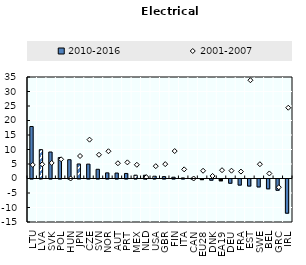
| Category | 2010-2016 |
|---|---|
| LTU | 17.933 |
| LVA | 9.96 |
| SVK | 9.135 |
| POL | 7.217 |
| HUN | 6.482 |
| JPN | 5.011 |
| CZE | 4.959 |
| SVN | 3.174 |
| NOR | 1.942 |
| AUT | 1.878 |
| PRT | 1.74 |
| MEX | 1.147 |
| NLD | 1.113 |
| USA | 0.786 |
| GBR | 0.655 |
| FIN | 0.445 |
| ITA | 0.192 |
| CAN | 0.094 |
| EU28 | -0.217 |
| DNK | -0.418 |
| EA19 | -0.608 |
| DEU | -1.468 |
| FRA | -2.104 |
| EST | -2.44 |
| SWE | -2.739 |
| BEL | -3.393 |
| GRC | -3.885 |
| IRL | -11.795 |